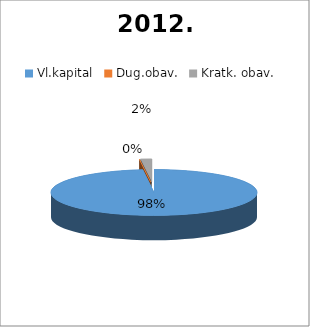
| Category | 2012. |
|---|---|
| Vl.kapital | 2571756 |
| Dug.obav. | 0 |
| Kratk. obav. | 45700 |